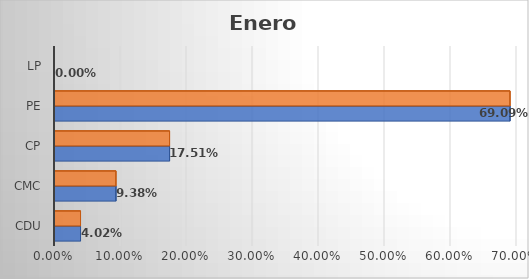
| Category | Series 0 | Series 1 |
|---|---|---|
| CDU | 0.04 | 0.04 |
| CMC | 0.094 | 0.094 |
| CP | 0.175 | 0.175 |
| PE | 0.691 | 0.691 |
| LP | 0 | 0 |